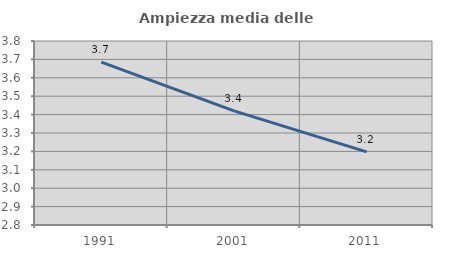
| Category | Ampiezza media delle famiglie |
|---|---|
| 1991.0 | 3.685 |
| 2001.0 | 3.42 |
| 2011.0 | 3.198 |